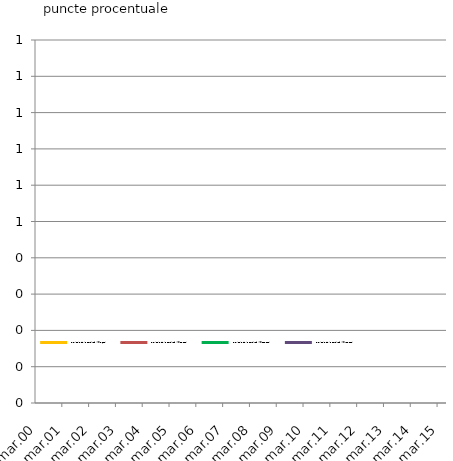
| Category | Deviaţie de la tendinţă (λ=1,600) | Deviaţie de la tendinţă (λ=25,000) | Deviaţie de la tendinţă (λ=125,000) | Deviaţie de la tendinţă (λ=400,000) |
|---|---|---|---|---|
| 2000-03-01 | 0 | 0 | 0 | 0 |
| 2000-06-01 | 0 | 0 | 0 | 0 |
| 2000-09-01 | 0 | 0 | 0 | 0 |
| 2000-12-01 | 0 | 0 | 0 | 0 |
| 2001-03-01 | 0 | 0 | 0 | 0 |
| 2001-06-01 | 0 | 0 | 0 | 0 |
| 2001-09-01 | 0 | 0 | 0 | 0 |
| 2001-12-01 | 0 | 0 | 0 | 0 |
| 2002-03-01 | 0 | 0 | 0 | 0 |
| 2002-06-01 | 0 | 0 | 0 | 0 |
| 2002-09-01 | 0 | 0 | 0 | 0 |
| 2002-12-01 | 0 | 0 | 0 | 0 |
| 2003-03-01 | 0 | 0 | 0 | 0 |
| 2003-06-01 | 0 | 0 | 0 | 0 |
| 2003-09-01 | 0 | 0 | 0 | 0 |
| 2003-12-01 | 0 | 0 | 0 | 0 |
| 2004-03-01 | 0 | 0 | 0 | 0 |
| 2004-06-01 | 0 | 0 | 0 | 0 |
| 2004-09-01 | 0 | 0 | 0 | 0 |
| 2004-12-01 | 0 | 0 | 0 | 0 |
| 2005-03-01 | 0 | 0 | 0 | 0 |
| 2005-06-01 | 0 | 0 | 0 | 0 |
| 2005-09-01 | 0 | 0 | 0 | 0 |
| 2005-12-01 | 0 | 0 | 0 | 0 |
| 2006-03-01 | 0 | 0 | 0 | 0 |
| 2006-06-01 | 0 | 0 | 0 | 0 |
| 2006-09-01 | 0 | 0 | 0 | 0 |
| 2006-12-01 | 0 | 0 | 0 | 0 |
| 2007-03-01 | 0 | 0 | 0 | 0 |
| 2007-06-01 | 0 | 0 | 0 | 0 |
| 2007-09-01 | 0 | 0 | 0 | 0 |
| 2007-12-01 | 0 | 0 | 0 | 0 |
| 2008-03-01 | 0 | 0 | 0 | 0 |
| 2008-06-01 | 0 | 0 | 0 | 0 |
| 2008-09-01 | 0 | 0 | 0 | 0 |
| 2008-12-01 | 0 | 0 | 0 | 0 |
| 2009-03-01 | 0 | 0 | 0 | 0 |
| 2009-06-01 | 0 | 0 | 0 | 0 |
| 2009-09-01 | 0 | 0 | 0 | 0 |
| 2009-12-01 | 0 | 0 | 0 | 0 |
| 2010-03-01 | 0 | 0 | 0 | 0 |
| 2010-06-01 | 0 | 0 | 0 | 0 |
| 2010-09-01 | 0 | 0 | 0 | 0 |
| 2010-12-01 | 0 | 0 | 0 | 0 |
| 2011-03-01 | 0 | 0 | 0 | 0 |
| 2011-06-01 | 0 | 0 | 0 | 0 |
| 2011-09-01 | 0 | 0 | 0 | 0 |
| 2011-12-01 | 0 | 0 | 0 | 0 |
| 2012-03-01 | 0 | 0 | 0 | 0 |
| 2012-06-01 | 0 | 0 | 0 | 0 |
| 2012-09-01 | 0 | 0 | 0 | 0 |
| 2012-12-01 | 0 | 0 | 0 | 0 |
| 2013-03-01 | 0 | 0 | 0 | 0 |
| 2013-06-01 | 0 | 0 | 0 | 0 |
| 2013-09-01 | 0 | 0 | 0 | 0 |
| 2013-12-01 | 0 | 0 | 0 | 0 |
| 2014-03-01 | 0 | 0 | 0 | 0 |
| 2014-06-01 | 0 | 0 | 0 | 0 |
| 2014-09-01 | 0 | 0 | 0 | 0 |
| 2014-12-01 | 0 | 0 | 0 | 0 |
| 2015-03-01 | 0 | 0 | 0 | 0 |
| 2015-06-01 | 0 | 0 | 0 | 0 |